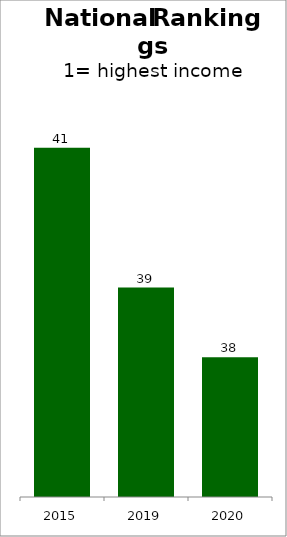
| Category | Series 0 |
|---|---|
| 2015.0 | 41 |
| 2019.0 | 39 |
| 2020.0 | 38 |